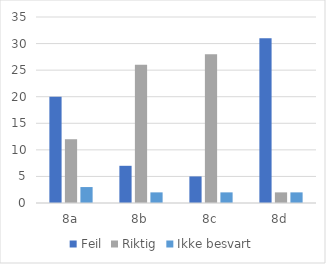
| Category | Feil | Riktig | Ikke besvart |
|---|---|---|---|
| 8a | 20 | 12 | 3 |
| 8b | 7 | 26 | 2 |
| 8c | 5 | 28 | 2 |
| 8d | 31 | 2 | 2 |